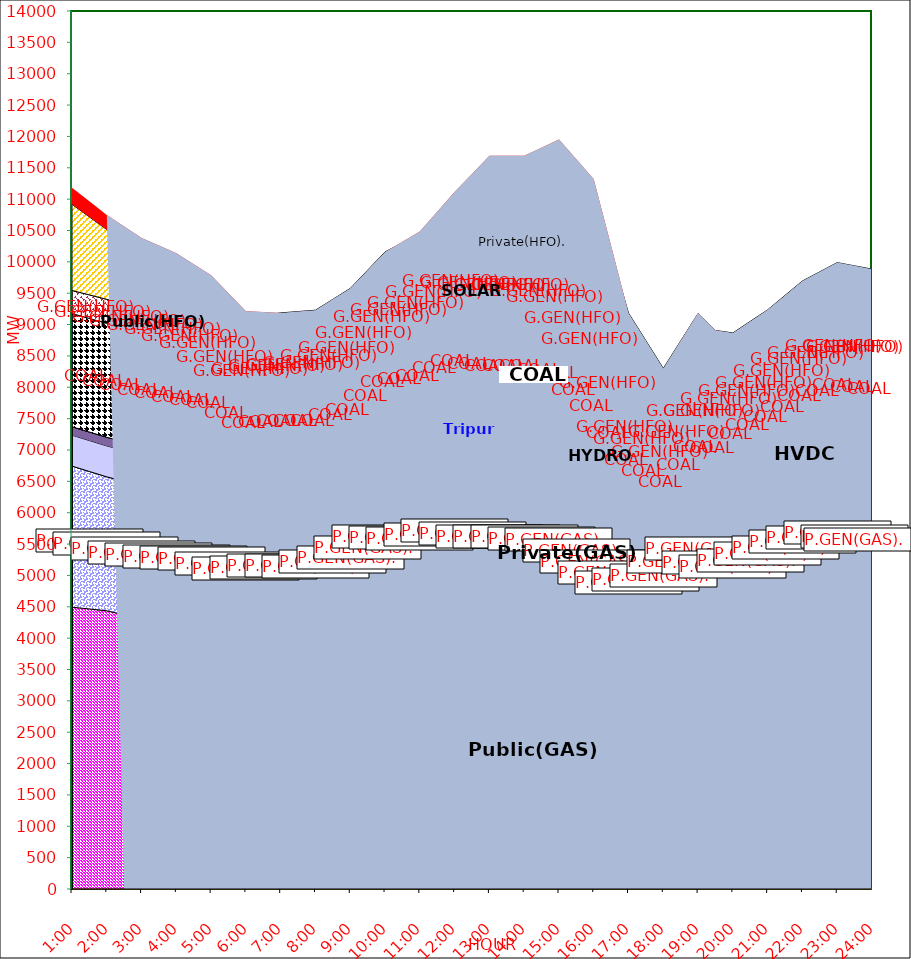
| Category | GAS | P.GEN(GAS). |  HVDC | TRIPURA | HYDRO | COAL | SOLAR | G.GEN(HFO) | P.GEN(HFO). | G.GEN(HSD) | P.GEN(HSD) | SHORTAGE | Total Energy Gen 245.460 MKWHr 
Energy Not Served   2.118 MKWHr 
Energy Requirement     247.578 MKWHr  |
|---|---|---|---|---|---|---|---|---|---|---|---|---|---|
| 1:00 | 4494 | 2249 | 493 | 134 | 0 | 1806 | 0 | 368 | 1374 | 0 | 0 | 264.535 |  |
| 1:30 | 4465 | 2192.5 | 493 | 136 | 0 | 1811.5 | 0 | 375.5 | 1243 | 0 | 0 | 248.777 |  |
| 2:00 | 4436 | 2136 | 493 | 138 | 0 | 1817 | 0 | 383 | 1112 | 0 | 0 | 233.02 |  |
| 2:30 | 4371.5 | 2129 | 493 | 137 | 0 | 1822.5 | 0 | 366.5 | 1030 | 0 | 0 | 215.352 |  |
| 3:00 | 4307 | 2122 | 493 | 136 | 0 | 1828 | 0 | 350 | 948 | 0 | 0 | 197.685 |  |
| 3:30 | 4299.5 | 2070.5 | 493.5 | 135 | 0 | 1826 | 0 | 342 | 902.5 | 0 | 0 | 191 |  |
| 4:00 | 4292 | 2019 | 494 | 134 | 0 | 1824 | 0 | 334 | 857 | 0 | 0 | 184.315 |  |
| 4:30 | 4274.5 | 2025 | 493.5 | 130 | 0 | 1762 | 0 | 280 | 829 | 0 | 0 | 168.08 |  |
| 5:00 | 4257 | 2031 | 493 | 126 | 0 | 1700 | 0 | 226 | 801 | 0 | 0 | 151.845 |  |
| 5:30 | 4198.5 | 1991.5 | 493.5 | 120 | 0 | 1591.5 | 7.5 | 176.5 | 793.5 | 0 | 0 | 126.06 |  |
| 6:00 | 4140 | 1952 | 494 | 114 | 0 | 1483 | 15 | 127 | 786 | 0 | 0 | 100.275 |  |
| 6:30 | 4160.5 | 1946 | 494 | 113 | 0 | 1482 | 46 | 125 | 782 | 0 | 0 | 50.137 |  |
| 7:00 | 4181 | 1940 | 494 | 112 | 0 | 1481 | 77 | 123 | 778 | 0 | 0 | 0 |  |
| 7:30 | 4180 | 1941 | 495 | 115 | 0 | 1482 | 127 | 61.5 | 806 | 0 | 0 | 0 |  |
| 8:00 | 4179 | 1942 | 496 | 118 | 0 | 1483 | 177 | 0 | 834 | 0 | 0 | 0 |  |
| 8:30 | 4224 | 1981.5 | 495.5 | 122 | 0 | 1481.5 | 206.5 | 0 | 891.5 | 0 | 0 | 0 |  |
| 9:00 | 4269 | 2021 | 495 | 126 | 0 | 1480 | 236 | 0 | 949 | 0 | 0 | 0 |  |
| 9:30 | 4395.5 | 2101.5 | 495 | 128 | 12.5 | 1482.5 | 264 | 0 | 988 | 0 | 0 | 0 |  |
| 10:00 | 4522 | 2182 | 495 | 130 | 25 | 1485 | 292 | 0 | 1027 | 0 | 0 | 0 |  |
| 10:30 | 4492.5 | 2218 | 495 | 133 | 25 | 1557.5 | 320.5 | 0 | 1060.5 | 0 | 0 | 19.1 |  |
| 11:00 | 4463 | 2254 | 495 | 136 | 25 | 1630 | 349 | 0 | 1094 | 0 | 0 | 38.2 |  |
| 11:30 | 4502.5 | 2295 | 495 | 142 | 25 | 1699 | 359 | 14 | 1241 | 0 | 0 | 27.217 |  |
| 12:00 | 4542 | 2336 | 495 | 148 | 25 | 1768 | 369 | 28 | 1388 | 0 | 0 | 16.235 |  |
| 12:30 | 4502 | 2326.5 | 495 | 148 | 25 | 1780.5 | 347.5 | 90.5 | 1562 | 0 | 0 | 125.582 |  |
| 13:00 | 4462 | 2317 | 495 | 148 | 25 | 1793 | 326 | 153 | 1736 | 0 | 0 | 234.93 |  |
| 13:30 | 4462 | 2317 | 495 | 148 | 25 | 1793 | 326 | 153 | 1736 | 0 | 0 | 234.93 |  |
| 14:00 | 4462 | 2317 | 495 | 148 | 25 | 1793 | 326 | 153 | 1736 | 0 | 0 | 234.93 |  |
| 14:30 | 4465.5 | 2256.5 | 490.5 | 150 | 25 | 1797.5 | 242.5 | 229.5 | 1905.5 | 0 | 0 | 258.327 |  |
| 15:00 | 4469 | 2196 | 486 | 152 | 25 | 1802 | 159 | 306 | 2075 | 0 | 0 | 281.725 |  |
| 15:30 | 4341.5 | 2103 | 485.5 | 150 | 25 | 1722 | 115.5 | 339 | 2083 | 0 | 0 | 270.265 |  |
| 16:00 | 4214 | 2010 | 485 | 148 | 25 | 1642 | 72 | 372 | 2091 | 0 | 0 | 258.805 |  |
| 16:30 | 4060.5 | 1978.5 | 470.5 | 141 | 25 | 1197 | 51.5 | 315.5 | 1882 | 0 | 0 | 129.403 |  |
| 17:00 | 3907 | 1947 | 456 | 134 | 25 | 752 | 31 | 259 | 1673 | 0 | 0 | 0 |  |
| 17:30 | 3962 | 1951 | 228 | 137 | 25 | 732.5 | 19 | 247.5 | 1440.5 | 0 | 0 | 0 |  |
| 18:00 | 4017 | 1955 | 0 | 140 | 25 | 713 | 7 | 236 | 1208 | 0 | 0 | 0 |  |
| 18:30 | 4202.5 | 2026 | 0 | 118 | 25 | 808 | 3.5 | 233 | 1322.5 | 0 | 0 | 5 |  |
| 19:00 | 4388 | 2097 | 0 | 96 | 25 | 903 | 0 | 230 | 1437 | 0 | 0 | 10 |  |
| 19:30 | 4167 | 2086 | 160 | 66 | 25 | 1073 | 0 | 118 | 1211 | 0 | 0 | 5 |  |
| 20:00 | 4122 | 2050 | 485 | 102 | 25 | 973 | 0 | 118 | 991 | 0 | 0 | 0 |  |
| 20:30 | 4201.5 | 2087.5 | 485 | 117 | 25 | 974 | 0 | 113 | 1047.5 | 0 | 0 | 0 |  |
| 21:00 | 4281 | 2125 | 485 | 132 | 25 | 975 | 0 | 108 | 1104 | 0 | 0 | 0 |  |
| 21:30 | 4336.5 | 2209.5 | 485 | 130 | 25 | 1029 | 0 | 105 | 1145 | 0 | 0 | 0 |  |
| 22:00 | 4392 | 2294 | 485 | 128 | 25 | 1083 | 0 | 102 | 1186 | 0 | 0 | 0 |  |
| 22:30 | 4453 | 2316 | 485 | 130 | 12.5 | 1115 | 0 | 102 | 1228 | 0 | 0 | 0 |  |
| 23:00 | 4514 | 2338 | 485 | 132 | 0 | 1147 | 0 | 102 | 1270 | 0 | 0 | 0 |  |
| 23:30 | 4459.5 | 2333 | 485 | 132 | 0 | 1197 | 0 | 102 | 1227.5 | 0 | 0 | 0 |  |
| 24:00 | 4405 | 2328 | 485 | 132 | 0 | 1247 | 0 | 102 | 1185 | 0 | 0 | 0 |  |